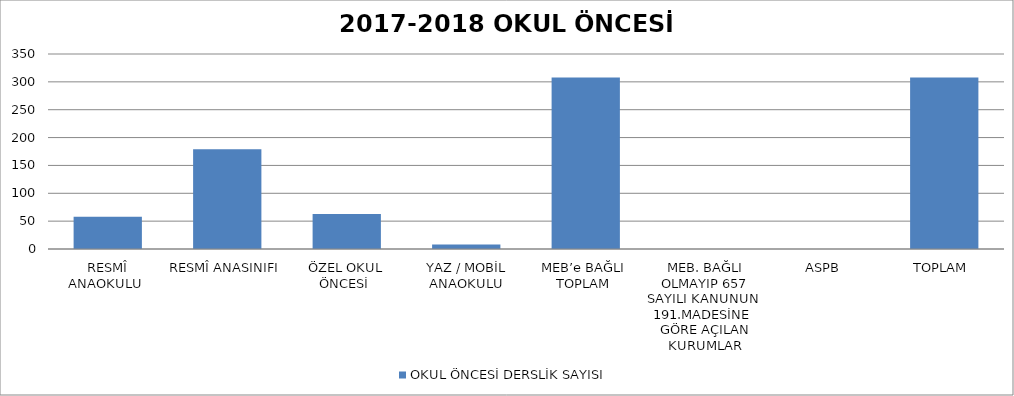
| Category | OKUL ÖNCESİ DERSLİK SAYISI |
|---|---|
| RESMÎ ANAOKULU  | 58 |
| RESMÎ ANASINIFI  | 179 |
| ÖZEL OKUL ÖNCESİ  | 63 |
| YAZ / MOBİL ANAOKULU | 8 |
| MEB’e BAĞLI  TOPLAM  | 308 |
| MEB. BAĞLI OLMAYIP 657 SAYILI KANUNUN  191.MADESİNE  GÖRE AÇILAN KURUMLAR | 0 |
| ASPB | 0 |
| TOPLAM  | 308 |